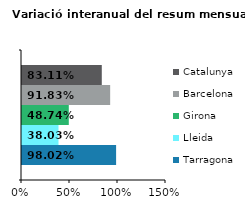
| Category | Tarragona | Lleida | Girona | Barcelona | Catalunya |
|---|---|---|---|---|---|
| 0 | 0.98 | 0.38 | 0.487 | 0.918 | 0.831 |